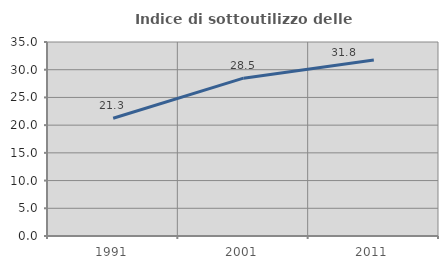
| Category | Indice di sottoutilizzo delle abitazioni  |
|---|---|
| 1991.0 | 21.251 |
| 2001.0 | 28.477 |
| 2011.0 | 31.768 |